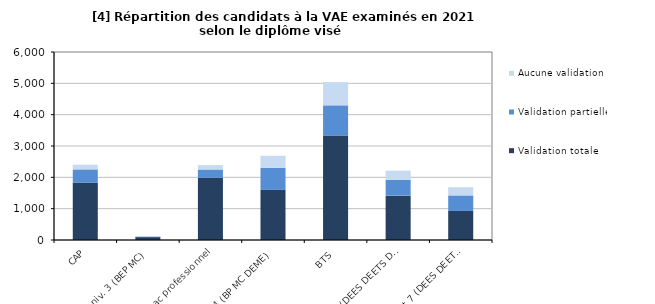
| Category | Validation totale | Validation partielle | Aucune validation |
|---|---|---|---|
| CAP | 1825 | 428 | 151 |
| Autre niv. 3 (BEP MC) | 92 | 16 | 16 |
| Bac professionnel | 1985 | 264 | 140 |
| Autre niv. 4 (BP MC DEME) | 1600 | 704 | 384 |
| BTS | 3333 | 965 | 741 |
| Autre niv. 5 (DEES DEETS DECESF) | 1416 | 507 | 290 |
| Niveaux 6 et 7 (DEES DEETS DECESF DCG DSCG) | 927 | 496 | 261 |